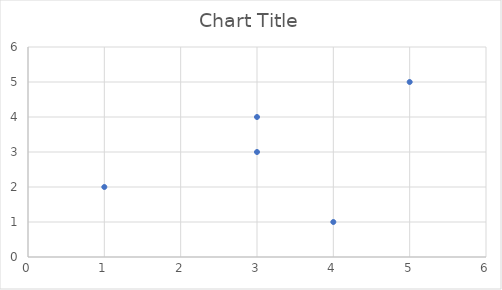
| Category | Series 0 |
|---|---|
| 1.0 | 2 |
| 3.0 | 4 |
| 4.0 | 1 |
| 5.0 | 5 |
| 3.0 | 3 |